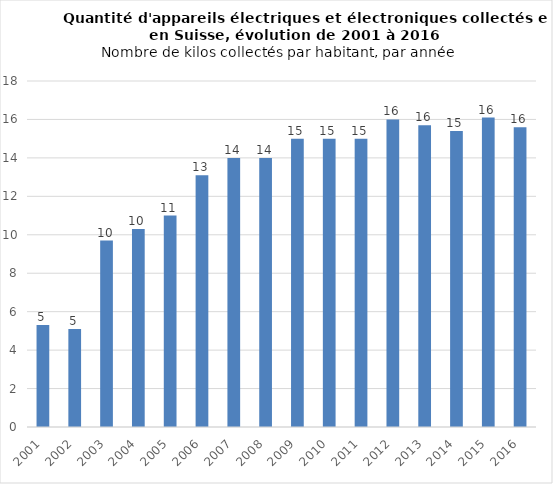
| Category | Series 0 |
|---|---|
| 2001.0 | 5.3 |
| 2002.0 | 5.1 |
| 2003.0 | 9.7 |
| 2004.0 | 10.3 |
| 2005.0 | 11 |
| 2006.0 | 13.1 |
| 2007.0 | 14 |
| 2008.0 | 14 |
| 2009.0 | 15 |
| 2010.0 | 15 |
| 2011.0 | 15 |
| 2012.0 | 16 |
| 2013.0 | 15.7 |
| 2014.0 | 15.4 |
| 2015.0 | 16.1 |
| 2016.0 | 15.6 |